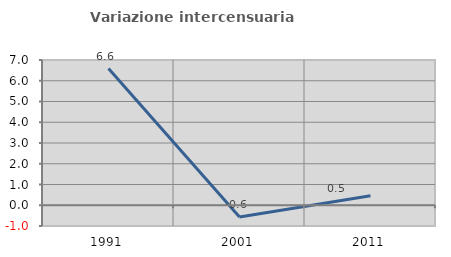
| Category | Variazione intercensuaria annua |
|---|---|
| 1991.0 | 6.586 |
| 2001.0 | -0.569 |
| 2011.0 | 0.455 |